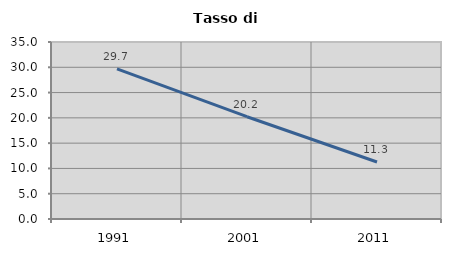
| Category | Tasso di disoccupazione   |
|---|---|
| 1991.0 | 29.699 |
| 2001.0 | 20.227 |
| 2011.0 | 11.265 |